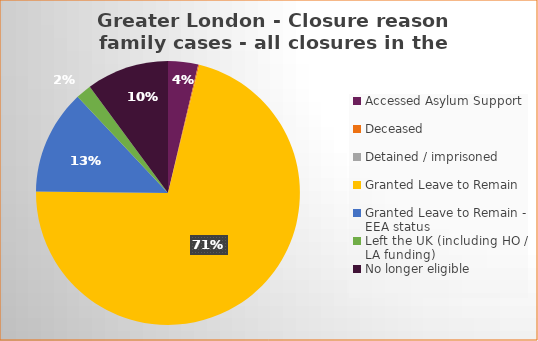
| Category | Total | Percentage |
|---|---|---|
| Accessed Asylum Support | 27 | 0.037 |
| Deceased | 1 | 0.001 |
| Detained / imprisoned | 0 | 0 |
| Granted Leave to Remain | 523 | 0.714 |
| Granted Leave to Remain - EEA status | 94 | 0.128 |
| Left the UK (including HO / LA funding)  | 14 | 0.019 |
| No longer eligible | 74 | 0.101 |